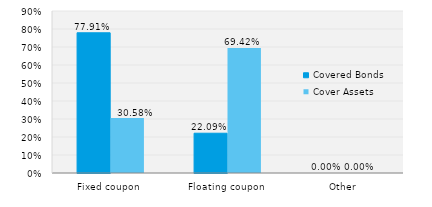
| Category | Covered Bonds | Cover Assets |
|---|---|---|
| Fixed coupon | 0.779 | 0.306 |
| Floating coupon | 0.221 | 0.694 |
| Other | 0 | 0 |